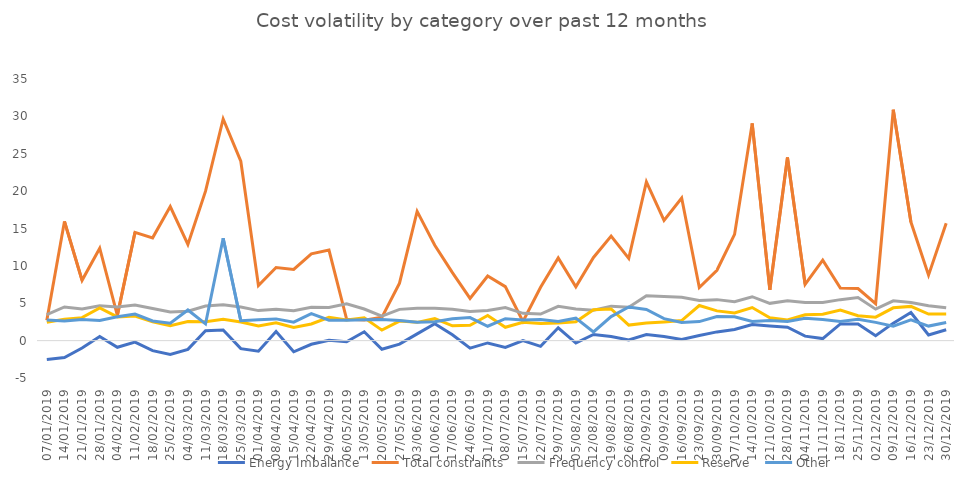
| Category | Energy Imbalance | Total constraints | Frequency control | Reserve | Other |
|---|---|---|---|---|---|
| 07/01/2019 | -2.523 | 2.725 | 3.465 | 2.468 | 2.772 |
| 14/01/2019 | -2.271 | 15.948 | 4.503 | 2.848 | 2.612 |
| 21/01/2019 | -0.986 | 8.069 | 4.236 | 3.076 | 2.825 |
| 28/01/2019 | 0.548 | 12.368 | 4.671 | 4.362 | 2.687 |
| 04/02/2019 | -0.888 | 3.384 | 4.498 | 3.178 | 3.191 |
| 11/02/2019 | -0.205 | 14.489 | 4.751 | 3.299 | 3.563 |
| 18/02/2019 | -1.342 | 13.752 | 4.289 | 2.515 | 2.635 |
| 25/02/2019 | -1.843 | 17.932 | 3.829 | 1.998 | 2.336 |
| 04/03/2019 | -1.174 | 12.864 | 3.928 | 2.569 | 4.103 |
| 11/03/2019 | 1.325 | 19.999 | 4.619 | 2.513 | 2.247 |
| 18/03/2019 | 1.423 | 29.65 | 4.798 | 2.844 | 13.688 |
| 25/03/2019 | -1.072 | 24.004 | 4.487 | 2.484 | 2.658 |
| 01/04/2019 | -1.405 | 7.368 | 4.017 | 1.95 | 2.778 |
| 08/04/2019 | 1.228 | 9.779 | 4.207 | 2.391 | 2.908 |
| 15/04/2019 | -1.495 | 9.524 | 4.007 | 1.761 | 2.464 |
| 22/04/2019 | -0.491 | 11.609 | 4.467 | 2.223 | 3.61 |
| 29/04/2019 | 0.051 | 12.118 | 4.442 | 3.122 | 2.733 |
| 06/05/2019 | -0.142 | 2.875 | 4.925 | 2.76 | 2.742 |
| 13/05/2019 | 1.189 | 2.744 | 4.226 | 3.061 | 2.797 |
| 20/05/2019 | -1.146 | 3.116 | 3.288 | 1.404 | 2.815 |
| 27/05/2019 | -0.467 | 7.685 | 4.18 | 2.612 | 2.683 |
| 03/06/2019 | 0.907 | 17.292 | 4.339 | 2.445 | 2.463 |
| 10/06/2019 | 2.27 | 12.763 | 4.332 | 2.937 | 2.536 |
| 17/06/2019 | 0.778 | 9.09 | 4.207 | 1.987 | 2.931 |
| 24/06/2019 | -1.01 | 5.643 | 3.898 | 2.049 | 3.088 |
| 01/07/2019 | -0.309 | 8.651 | 4.027 | 3.355 | 1.926 |
| 08/07/2019 | -0.918 | 7.226 | 4.422 | 1.79 | 2.934 |
| 15/07/2019 | 0.013 | 2.561 | 3.651 | 2.467 | 2.755 |
| 22/07/2019 | -0.771 | 7.14 | 3.547 | 2.281 | 2.838 |
| 29/07/2019 | 1.713 | 11.07 | 4.58 | 2.373 | 2.574 |
| 05/08/2019 | -0.328 | 7.195 | 4.223 | 2.523 | 3.004 |
| 12/08/2019 | 0.817 | 11.128 | 4.076 | 4.132 | 1.16 |
| 19/08/2019 | 0.553 | 13.989 | 4.614 | 4.229 | 3.216 |
| 26/08/2019 | 0.096 | 11.006 | 4.471 | 2.078 | 4.491 |
| 02/09/2019 | 0.803 | 21.234 | 5.998 | 2.345 | 4.168 |
| 09/09/2019 | 0.561 | 16.075 | 5.897 | 2.503 | 2.939 |
| 16/09/2019 | 0.143 | 19.073 | 5.791 | 2.687 | 2.436 |
| 23/09/2019 | 0.69 | 7.098 | 5.384 | 4.694 | 2.548 |
| 30/09/2019 | 1.167 | 9.415 | 5.484 | 3.98 | 3.22 |
| 07/10/2019 | 1.496 | 14.215 | 5.193 | 3.702 | 3.191 |
| 14/10/2019 | 2.15 | 29.052 | 5.875 | 4.43 | 2.557 |
| 21/10/2019 | 1.952 | 6.8 | 4.988 | 3.046 | 2.705 |
| 28/10/2019 | 1.798 | 24.494 | 5.318 | 2.766 | 2.558 |
| 04/11/2019 | 0.602 | 7.538 | 5.094 | 3.464 | 2.978 |
| 11/11/2019 | 0.273 | 10.759 | 5.113 | 3.539 | 2.84 |
| 18/11/2019 | 2.239 | 7.032 | 5.483 | 4.103 | 2.565 |
| 25/11/2019 | 2.233 | 6.965 | 5.77 | 3.342 | 2.846 |
| 02/12/2019 | 0.664 | 4.944 | 4.213 | 3.14 | 2.442 |
| 09/12/2019 | 2.34 | 30.892 | 5.326 | 4.388 | 1.933 |
| 16/12/2019 | 3.762 | 15.859 | 5.097 | 4.579 | 2.788 |
| 23/12/2019 | 0.762 | 8.762 | 4.659 | 3.546 | 1.947 |
| 30/12/2019 | 1.451 | 15.716 | 4.394 | 3.567 | 2.422 |